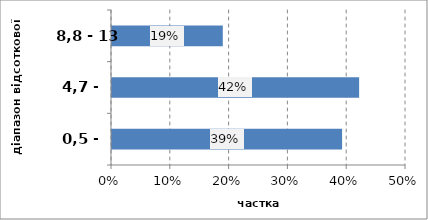
| Category | Series 0 |
|---|---|
| 0,5 - 4,7 | 0.391 |
| 4,7 - 8,8 | 0.42 |
| 8,8 - 13 | 0.188 |